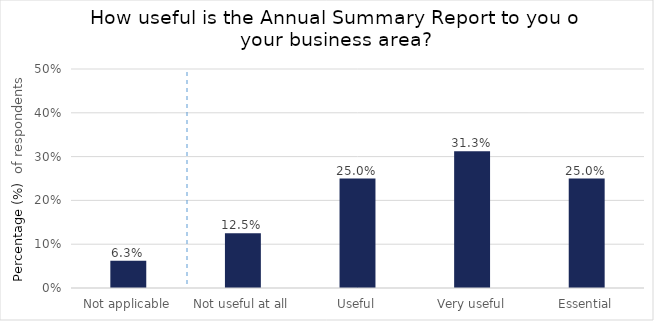
| Category | Not applicable |
|---|---|
| Not applicable | 0.062 |
| Not useful at all | 0.125 |
| Useful | 0.25 |
| Very useful | 0.312 |
| Essential | 0.25 |